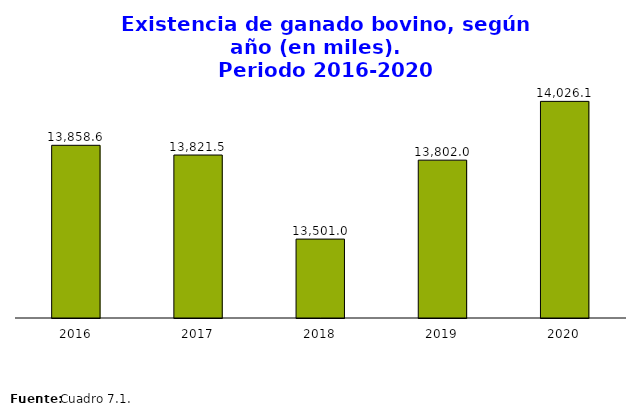
| Category | Total |
|---|---|
| 2016.0 | 13858.6 |
| 2017.0 | 13821.5 |
| 2018.0 | 13500.965 |
| 2019.0 | 13801.993 |
| 2020.0 | 14026.143 |